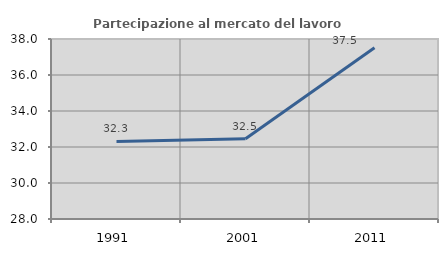
| Category | Partecipazione al mercato del lavoro  femminile |
|---|---|
| 1991.0 | 32.312 |
| 2001.0 | 32.462 |
| 2011.0 | 37.509 |